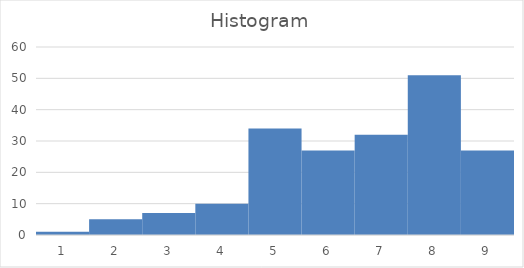
| Category | Series 0 |
|---|---|
| 0 | 1 |
| 1 | 5 |
| 2 | 7 |
| 3 | 10 |
| 4 | 34 |
| 5 | 27 |
| 6 | 32 |
| 7 | 51 |
| 8 | 27 |